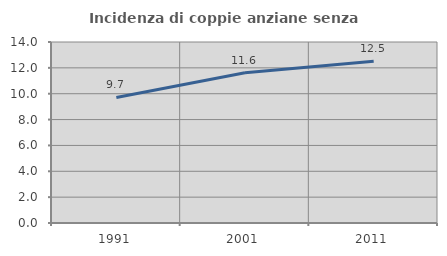
| Category | Incidenza di coppie anziane senza figli  |
|---|---|
| 1991.0 | 9.708 |
| 2001.0 | 11.615 |
| 2011.0 | 12.515 |